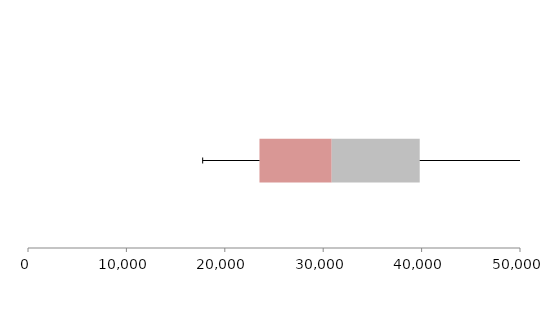
| Category | Series 1 | Series 2 | Series 3 |
|---|---|---|---|
| 0 | 23524.431 | 7339.651 | 8944.328 |